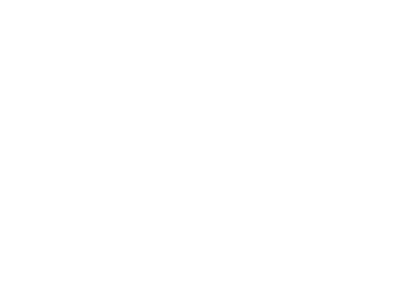
| Category | Total |
|---|---|
| A iniciar | 9 |
| Atrasado | 1 |
| Cancelado | 1 |
| Em dia | 11 |